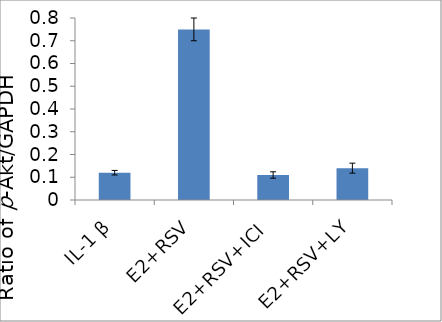
| Category | Series 0 |
|---|---|
| IL-1 β | 0.12 |
| E2+RSV | 0.75 |
| E2+RSV+ICI  | 0.11 |
| E2+RSV+LY | 0.14 |